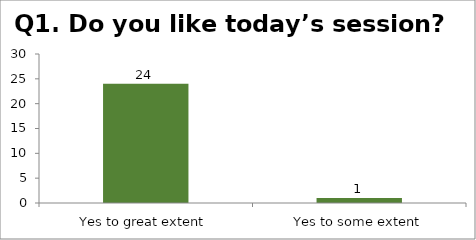
| Category | Q1. Do you like today’s session? |
|---|---|
| Yes to great extent | 24 |
| Yes to some extent | 1 |